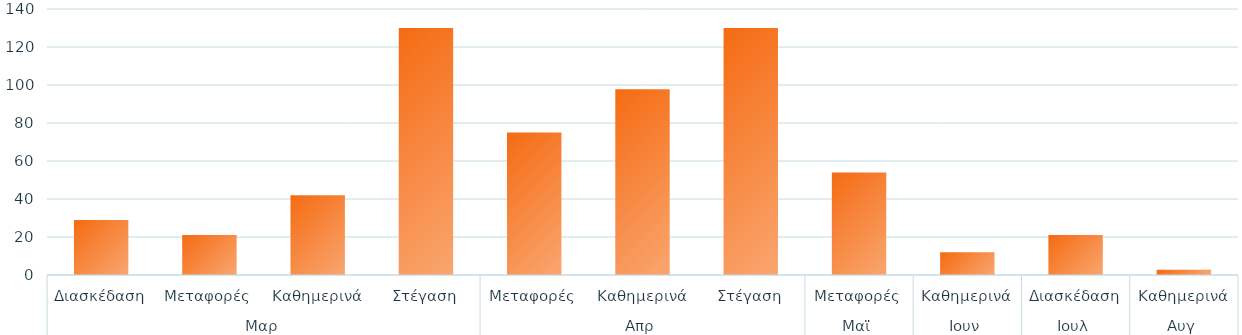
| Category | Άθροισμα |
|---|---|
| 0 | 29 |
| 1 | 21 |
| 2 | 42 |
| 3 | 130 |
| 4 | 75 |
| 5 | 97.75 |
| 6 | 130 |
| 7 | 54 |
| 8 | 12 |
| 9 | 21 |
| 10 | 2.75 |